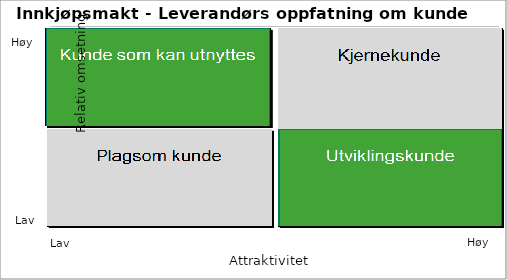
| Category | "Fyll inn navn" |
|---|---|
| 0.0 | 0 |